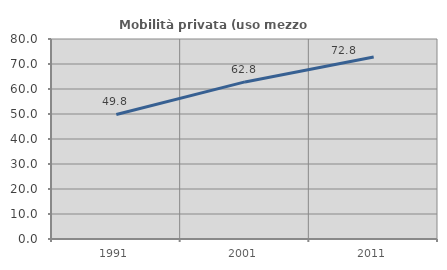
| Category | Mobilità privata (uso mezzo privato) |
|---|---|
| 1991.0 | 49.808 |
| 2001.0 | 62.838 |
| 2011.0 | 72.788 |